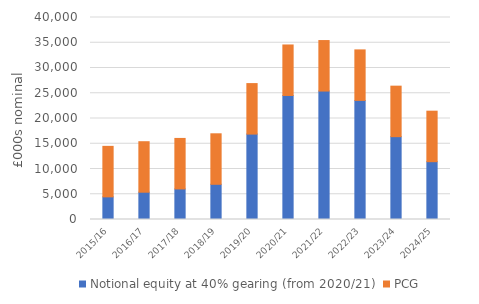
| Category | Notional equity at 40% gearing (from 2020/21) | PCG |
|---|---|---|
| 2015/16 | 4482.508 | 10000 |
| 2016/17 | 5404.028 | 10000 |
| 2017/18 | 6053.201 | 10000 |
| 2018/19 | 6970.591 | 10000 |
| 2019/20 | 16912.219 | 10000 |
| 2020/21 | 24560.664 | 10000 |
| 2021/22 | 25435.353 | 10000 |
| 2022/23 | 23586.133 | 10000 |
| 2023/24 | 16403.621 | 10000 |
| 2024/25 | 11449.103 | 10000 |